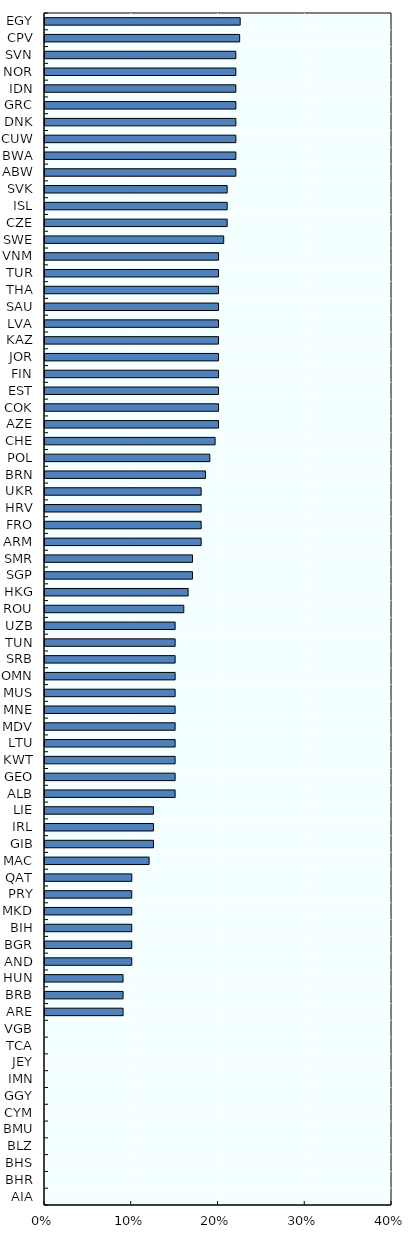
| Category | Series 0 |
|---|---|
| AIA | 0 |
| BHR | 0 |
| BHS | 0 |
| BLZ | 0 |
| BMU | 0 |
| CYM | 0 |
| GGY | 0 |
| IMN | 0 |
| JEY | 0 |
| TCA | 0 |
| VGB | 0 |
| ARE | 0.09 |
| BRB | 0.09 |
| HUN | 0.09 |
| AND | 0.1 |
| BGR | 0.1 |
| BIH | 0.1 |
| MKD | 0.1 |
| PRY | 0.1 |
| QAT | 0.1 |
| MAC | 0.12 |
| GIB | 0.125 |
| IRL | 0.125 |
| LIE | 0.125 |
| ALB | 0.15 |
| GEO | 0.15 |
| KWT | 0.15 |
| LTU | 0.15 |
| MDV | 0.15 |
| MNE | 0.15 |
| MUS | 0.15 |
| OMN | 0.15 |
| SRB | 0.15 |
| TUN | 0.15 |
| UZB | 0.15 |
| ROU | 0.16 |
| HKG | 0.165 |
| SGP | 0.17 |
| SMR | 0.17 |
| ARM | 0.18 |
| FRO | 0.18 |
| HRV | 0.18 |
| UKR | 0.18 |
| BRN | 0.185 |
| POL | 0.19 |
| CHE | 0.196 |
| AZE | 0.2 |
| COK | 0.2 |
| EST | 0.2 |
| FIN | 0.2 |
| JOR | 0.2 |
| KAZ | 0.2 |
| LVA | 0.2 |
| SAU | 0.2 |
| THA | 0.2 |
| TUR | 0.2 |
| VNM | 0.2 |
| SWE | 0.206 |
| CZE | 0.21 |
| ISL | 0.21 |
| SVK | 0.21 |
| ABW | 0.22 |
| BWA | 0.22 |
| CUW | 0.22 |
| DNK | 0.22 |
| GRC | 0.22 |
| IDN | 0.22 |
| NOR | 0.22 |
| SVN | 0.22 |
| CPV | 0.224 |
| EGY | 0.225 |